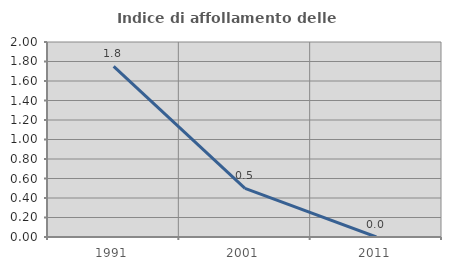
| Category | Indice di affollamento delle abitazioni  |
|---|---|
| 1991.0 | 1.75 |
| 2001.0 | 0.499 |
| 2011.0 | 0 |